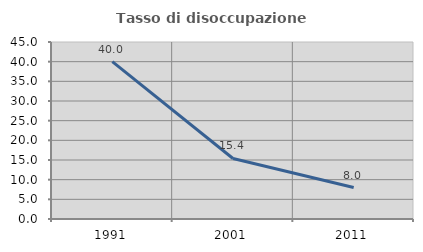
| Category | Tasso di disoccupazione giovanile  |
|---|---|
| 1991.0 | 40 |
| 2001.0 | 15.385 |
| 2011.0 | 8 |